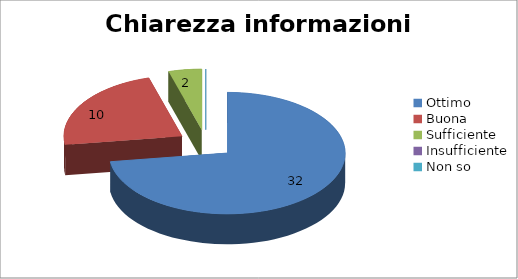
| Category | Chiarezza informazioni fornite |
|---|---|
| Ottimo | 32 |
| Buona | 10 |
| Sufficiente | 2 |
| Insufficiente | 0 |
| Non so | 0 |